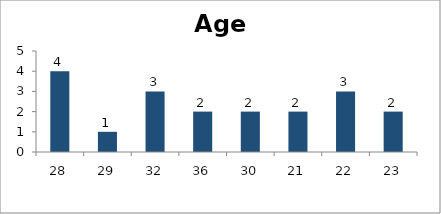
| Category | Age |
|---|---|
| 28.0 | 4 |
| 29.0 | 1 |
| 32.0 | 3 |
| 36.0 | 2 |
| 30.0 | 2 |
| 21.0 | 2 |
| 22.0 | 3 |
| 23.0 | 2 |